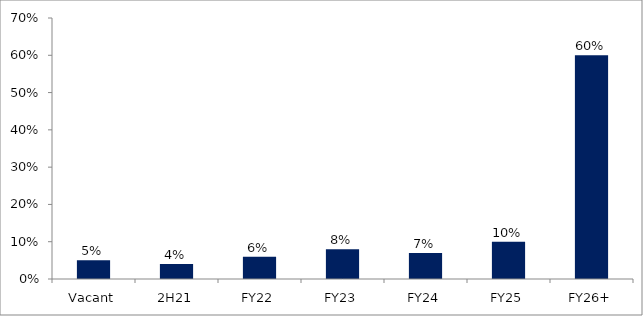
| Category | Series 0 |
|---|---|
| Vacant | 0.05 |
| 2H21 | 0.04 |
| FY22 | 0.06 |
| FY23 | 0.08 |
| FY24 | 0.07 |
| FY25 | 0.1 |
| FY26+ | 0.6 |